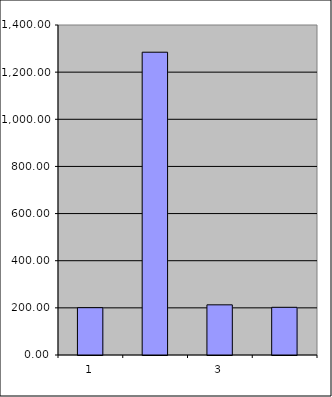
| Category | Series 0 |
|---|---|
| 0 | 200.75 |
| 1 | 1284.552 |
| 2 | 212.805 |
| 3 | 202.313 |